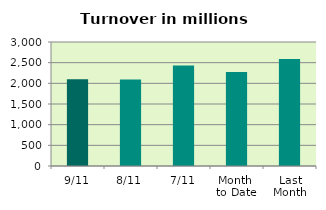
| Category | Series 0 |
|---|---|
| 9/11 | 2100.55 |
| 8/11 | 2094.653 |
| 7/11 | 2430.876 |
| Month 
to Date | 2275.008 |
| Last
Month | 2586.958 |